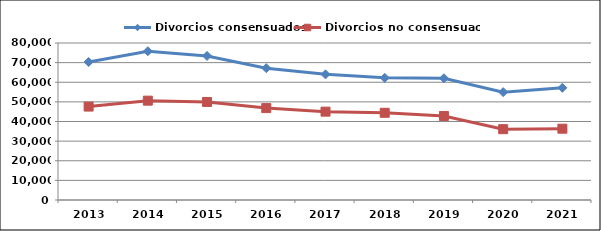
| Category | Divorcios consensuados | Divorcios no consensuados |
|---|---|---|
| 2013.0 | 70329 | 47611 |
| 2014.0 | 75820 | 50626 |
| 2015.0 | 73414 | 49963 |
| 2016.0 | 67189 | 46830 |
| 2017.0 | 64024 | 45019 |
| 2018.0 | 62241 | 44433 |
| 2019.0 | 62020 | 42826 |
| 2020.0 | 54960 | 36090 |
| 2021.0 | 57168 | 36337 |